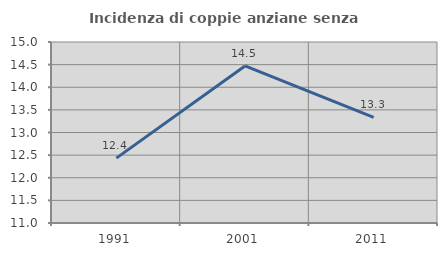
| Category | Incidenza di coppie anziane senza figli  |
|---|---|
| 1991.0 | 12.433 |
| 2001.0 | 14.471 |
| 2011.0 | 13.333 |